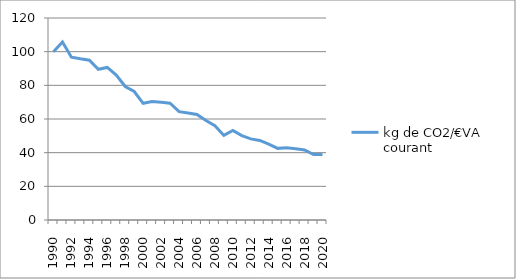
| Category | kg de CO2/€VA courant  |
|---|---|
| 1990.0 | 100 |
| 1991.0 | 105.707 |
| 1992.0 | 96.686 |
| 1993.0 | 95.746 |
| 1994.0 | 94.963 |
| 1995.0 | 89.551 |
| 1996.0 | 90.639 |
| 1997.0 | 86.131 |
| 1998.0 | 79.309 |
| 1999.0 | 76.323 |
| 2000.0 | 69.325 |
| 2001.0 | 70.406 |
| 2002.0 | 69.966 |
| 2003.0 | 69.367 |
| 2004.0 | 64.348 |
| 2005.0 | 63.594 |
| 2006.0 | 62.683 |
| 2007.0 | 59.098 |
| 2008.0 | 55.968 |
| 2009.0 | 50.244 |
| 2010.0 | 53.163 |
| 2011.0 | 50.098 |
| 2012.0 | 48.169 |
| 2013.0 | 47.261 |
| 2014.0 | 45.042 |
| 2015.0 | 42.555 |
| 2016.0 | 42.926 |
| 2017.0 | 42.388 |
| 2018.0 | 41.576 |
| 2019.0 | 38.903 |
| 2020.0 | 38.916 |